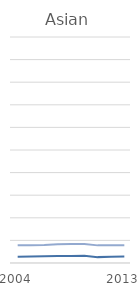
| Category | Asian Staff | Asian Student |
|---|---|---|
| 2004 | 2.8 | 7.8 |
|  | 2.9 | 7.9 |
|  | 3 | 8 |
|  | 3.1 | 8.3 |
|  | 3.1 | 8.4 |
|  | 3.2 | 8.4 |
|  | 2.6 | 7.8 |
|  | 2.8 | 7.8 |
| 2013 | 2.9 | 7.9 |